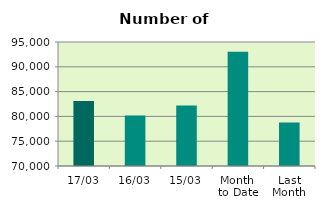
| Category | Series 0 |
|---|---|
| 17/03 | 83088 |
| 16/03 | 80162 |
| 15/03 | 82198 |
| Month 
to Date | 93031.231 |
| Last
Month | 78748.7 |